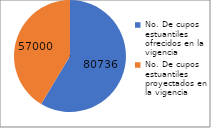
| Category | Series 0 |
|---|---|
| No. De cupos estuantiles ofrecidos en la vigencia | 80736 |
| No. De cupos estuantiles proyectados en la vigencia | 57000 |